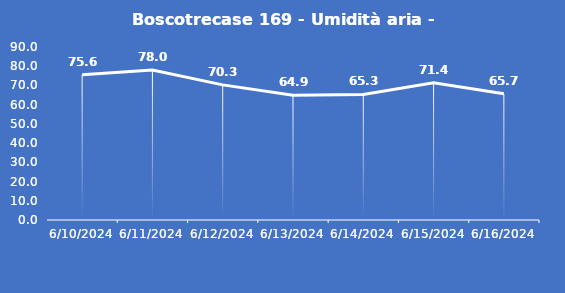
| Category | Boscotrecase 169 - Umidità aria - Grezzo (%) |
|---|---|
| 6/10/24 | 75.6 |
| 6/11/24 | 78 |
| 6/12/24 | 70.3 |
| 6/13/24 | 64.9 |
| 6/14/24 | 65.3 |
| 6/15/24 | 71.4 |
| 6/16/24 | 65.7 |